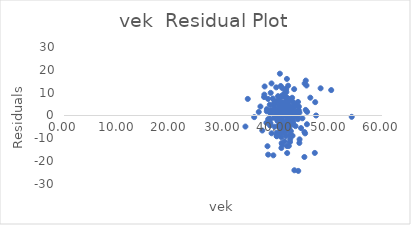
| Category | Series 0 |
|---|---|
| 44.42941176 | 1.267 |
| 45.61818182 | 15.292 |
| 39.77314815 | -0.004 |
| 34.2293578 | -4.838 |
| 40.37890045 | 8.461 |
| 41.37916667 | 0.406 |
| 40.14739884 | -7.557 |
| 41.89010617 | 0.977 |
| 40.44615736 | 6.416 |
| 42.92182663 | 2.316 |
| 42.30944056 | 5.403 |
| 40.90438871 | 12.918 |
| 39.04457831 | 1.216 |
| 39.58687259 | 5.071 |
| 37.06358768 | 3.928 |
| 40.84558824 | 4.869 |
| 39.67523364 | -1.017 |
| 41.83511043 | 4.699 |
| 40.26666667 | -2.366 |
| 41.19008783 | 8.168 |
| 47.32236842 | -16.393 |
| 41.82401316 | 6.189 |
| 41.74778761 | 11.513 |
| 38.53030303 | -1.577 |
| 47.4 | 5.841 |
| 41.96120556 | 10.309 |
| 41.86486486 | 4.587 |
| 43.5281583 | 3.82 |
| 40.11286255 | 0.775 |
| 41.19333333 | 11.954 |
| 41.7831216 | -0.415 |
| 37.80379747 | 9.138 |
| 40.74691358 | -8.422 |
| 41.58412483 | 1.537 |
| 42.34009009 | 3.233 |
| 37.41428571 | -6.567 |
| 37.85664008 | 12.716 |
| 40.60066225 | -0.663 |
| 40.26923077 | 1.883 |
| 44.98309859 | -1.22 |
| 43.42857143 | 11.537 |
| 43.04353933 | 7.772 |
| 39.70945274 | 6.327 |
| 40.86016097 | 0.132 |
| 38.25892857 | 1.859 |
| 39.82926829 | 5.192 |
| 40.41369048 | -4.631 |
| 34.67351598 | 7.261 |
| 42.47752809 | 4.036 |
| 45.75714286 | 13.141 |
| 42.80890052 | -6.839 |
| 39.46165192 | 4.633 |
| 38.50925926 | 7.245 |
| 39.2397454 | 1.591 |
| 41.53443379 | 9.561 |
| 42.01048218 | 3.293 |
| 40.04615385 | 12.322 |
| 42.0659824 | -13.358 |
| 38.51834862 | -17.142 |
| 38.69587629 | -2.834 |
| 43.5102597 | 0.723 |
| 41.61725293 | -2.875 |
| 43.68479532 | -4.661 |
| 42.0232375 | 3.18 |
| 40.85754584 | -6.265 |
| 38.18816254 | -3.186 |
| 44.02336449 | 4.661 |
| 47.56157113 | -0.001 |
| 45.49429875 | -7.832 |
| 42.67098943 | -10.403 |
| 44.41006424 | -12.019 |
| 43.8385214 | 1.246 |
| 42.51282051 | -6.517 |
| 41.39453125 | -7.326 |
| 43.08632479 | -0.567 |
| 41.6539823 | 8.21 |
| 40.41435768 | -2.295 |
| 40.92075665 | 1.416 |
| 41.76270374 | -4.326 |
| 38.87163814 | -4.394 |
| 45.4047619 | 14.023 |
| 39.16820276 | -7.789 |
| 38.96212673 | -3.364 |
| 40.56034483 | 7.16 |
| 40.46073653 | -2.409 |
| 42.96157458 | 6.465 |
| 43.97056618 | 0.104 |
| 50.41803279 | 11.134 |
| 42.95084746 | 1.918 |
| 43.14285714 | 4.078 |
| 43.87001647 | -0.038 |
| 39.07671958 | 2.564 |
| 40.50928793 | 4.352 |
| 42.29884226 | 0.917 |
| 38.2761194 | 2.778 |
| 41.01666667 | -14.236 |
| 40.73192771 | 18.317 |
| 44.30708226 | 2.247 |
| 40.21875 | -8.331 |
| 40.65454545 | -1.928 |
| 40.39206657 | 0.414 |
| 39.39114659 | 2.132 |
| 38.87201365 | 1.234 |
| 39.0 | 9.922 |
| 41.43099788 | 3.246 |
| 39.39555126 | 7.458 |
| 42.06387665 | -2.226 |
| 42.15234375 | 2.223 |
| 46.47844828 | 7.795 |
| 41.45246357 | 1.67 |
| 43.17400881 | -1.227 |
| 41.0148463 | 4.144 |
| 41.11385042 | 1.067 |
| 48.41752577 | 11.906 |
| 43.2875 | -0.938 |
| 36.74564797 | 1.544 |
| 42.2006079 | 7.12 |
| 41.0243553 | 8.609 |
| 42.05627706 | 16.017 |
| 39.89488636 | -0.301 |
| 40.90046566 | -2.303 |
| 42.27506775 | 7.436 |
| 42.23302108 | -3.164 |
| 41.57657658 | 1.28 |
| 41.64627406 | 9.504 |
| 38.85209424 | -1.574 |
| 40.37990762 | 2.381 |
| 41.12483347 | 5.739 |
| 38.92363878 | -1.544 |
| 40.96387154 | -3.916 |
| 42.7125 | 7.122 |
| 41.08779762 | -1.678 |
| 38.82302405 | 4.717 |
| 42.5819209 | -3.603 |
| 41.59541985 | 4.063 |
| 41.81756757 | 0.999 |
| 41.20851064 | 2.267 |
| 42.86786189 | 3.226 |
| 39.15497076 | 14.044 |
| 39.74146758 | 3.478 |
| 42.66772824 | -1.733 |
| 41.85266821 | -6.796 |
| 41.48726115 | -7.289 |
| 38.3960396 | -13.458 |
| 35.89107612 | -0.716 |
| 41.91616766 | 11.555 |
| 41.83223684 | 0.811 |
| 44.15280289 | 5.932 |
| 43.4676259 | 0.497 |
| 42.10839161 | -16.441 |
| 43.53816794 | 0.358 |
| 42.41528545 | -13.357 |
| 39.93069874 | 1.688 |
| 43.56597222 | 1.413 |
| 44.08995816 | -0.325 |
| 40.15420561 | -8.941 |
| 42.77586207 | -8.586 |
| 41.06752137 | -6.393 |
| 40.47592778 | -4.65 |
| 40.77419355 | -8.179 |
| 44.44711538 | -10.448 |
| 42.28723404 | 13.044 |
| 43.06275304 | 2.15 |
| 41.16844634 | -12.631 |
| 43.25465313 | -2.582 |
| 44.72319859 | -5.523 |
| 45.60472279 | 2.437 |
| 44.19874477 | -24.268 |
| 42.49250457 | 2.312 |
| 37.75688073 | 8.082 |
| 44.12775616 | -1.626 |
| 40.13589744 | -9.087 |
| 41.89717618 | -5.973 |
| 44.06603774 | 4.233 |
| 45.87563452 | 1.584 |
| 41.6800554 | -4.84 |
| 43.11959958 | -8.852 |
| 43.20256226 | -3.49 |
| 41.62658228 | -11.352 |
| 40.4379085 | -8.272 |
| 40.96550725 | -2.824 |
| 40.80114943 | -5.022 |
| 39.72791519 | -4.91 |
| 41.27039275 | -7.19 |
| 42.35881295 | -0.995 |
| 42.17567568 | -3.77 |
| 45.35714286 | -18.173 |
| 39.5 | -17.444 |
| 44.31994704 | 3.859 |
| 42.52693966 | -8.69 |
| 41.72764228 | 8.133 |
| 41.71573034 | -7.523 |
| 41.0212766 | -1.373 |
| 45.35661629 | -7.237 |
| 41.8594306 | -8.995 |
| 42.02156863 | -0.254 |
| 41.06304985 | -12.089 |
| 45.83884298 | -3.835 |
| 43.36059962 | 5.587 |
| 42.07309942 | 7.764 |
| 43.1740638 | -3.925 |
| 41.01101784 | -9.523 |
| 43.02571429 | 1.077 |
| 42.63170732 | -11.612 |
| 42.55734767 | 3.916 |
| 54.28787879 | -0.586 |
| 43.7653873 | 1.692 |
| 41.22413793 | 1.985 |
| 41.81303419 | -4.164 |
| 43.46585366 | -23.99 |
| 41.65920398 | 1.307 |
| 44.13950617 | 1.648 |
| 43.52625483 | -0.232 |
| 42.51414141 | -5.542 |
| 40.60132159 | 2.662 |